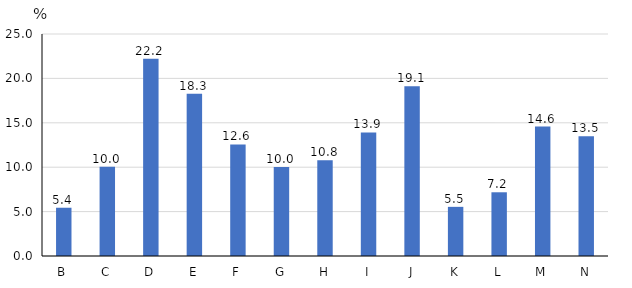
| Category | Series 0 |
|---|---|
| B | 5.435 |
| C | 10.041 |
| D | 22.222 |
| E | 18.269 |
| F | 12.558 |
| G | 10.028 |
| H | 10.784 |
| I | 13.908 |
| J | 19.107 |
| K | 5.535 |
| L | 7.176 |
| M | 14.573 |
| N | 13.486 |